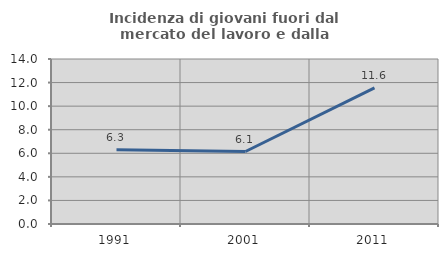
| Category | Incidenza di giovani fuori dal mercato del lavoro e dalla formazione  |
|---|---|
| 1991.0 | 6.296 |
| 2001.0 | 6.149 |
| 2011.0 | 11.552 |